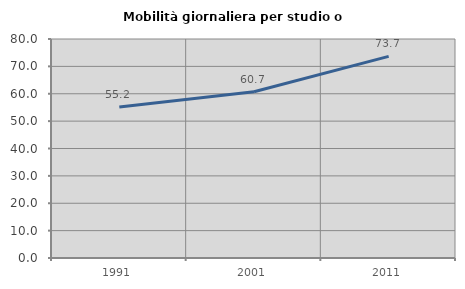
| Category | Mobilità giornaliera per studio o lavoro |
|---|---|
| 1991.0 | 55.169 |
| 2001.0 | 60.72 |
| 2011.0 | 73.661 |